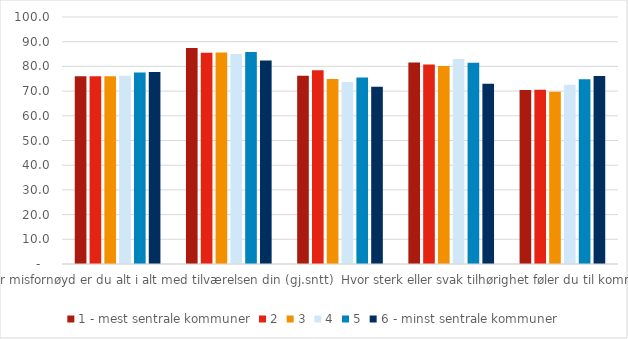
| Category | 1 - mest sentrale kommuner | 2 | 3 | 4 | 5 | 6 - minst sentrale kommuner |
|---|---|---|---|---|---|---|
| Hvor fornøyd eller misfornøyd er du alt i alt med tilværelsen din (gj.sntt) | 76.038 | 75.987 | 76.058 | 76.173 | 77.57 | 77.708 |
| Alt i alt, hvor fornøyd eller misfornøyd er du med Norge som et land å bo og leve i? - Å bo i Norge (gj.snitt) | 87.5 | 85.5 | 85.6 | 85 | 85.8 | 82.4 |
| Alt i alt, hvor fornøyd eller misfornøyd er du med kommunen din som et sted å bo og leve? (gj.snitt) | 76.2 | 78.4 | 74.9 | 73.7 | 75.5 | 71.8 |
| Regner du med å bo i den samme kommunen om 3 år? (andel ja) | 81.628 | 80.808 | 80.178 | 82.959 | 81.524 | 73.018 |
| Hvor sterk eller svak tilhørighet føler du til kommunen du bor i? (gj.snitt) | 70.4 | 70.5 | 69.7 | 72.6 | 74.8 | 76.1 |